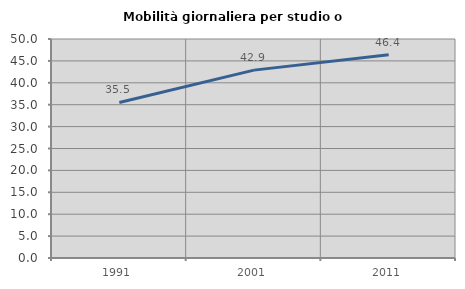
| Category | Mobilità giornaliera per studio o lavoro |
|---|---|
| 1991.0 | 35.506 |
| 2001.0 | 42.895 |
| 2011.0 | 46.403 |